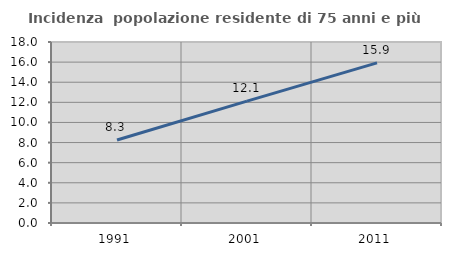
| Category | Incidenza  popolazione residente di 75 anni e più |
|---|---|
| 1991.0 | 8.252 |
| 2001.0 | 12.122 |
| 2011.0 | 15.93 |